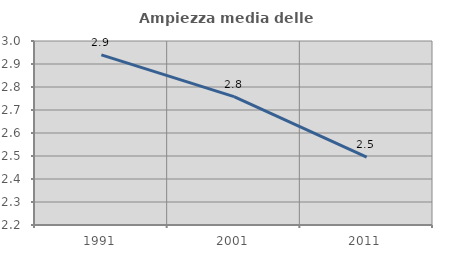
| Category | Ampiezza media delle famiglie |
|---|---|
| 1991.0 | 2.94 |
| 2001.0 | 2.758 |
| 2011.0 | 2.495 |